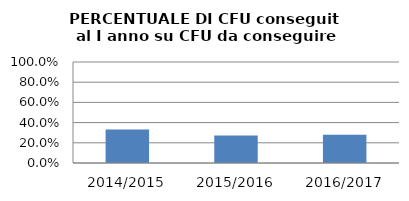
| Category | 2014/2015 2015/2016 2016/2017 |
|---|---|
| 2014/2015 | 0.332 |
| 2015/2016 | 0.272 |
| 2016/2017 | 0.279 |